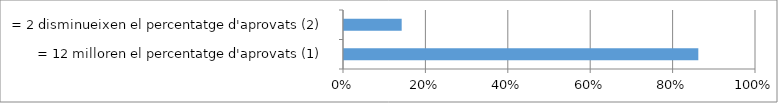
| Category | Series 0 |
|---|---|
| = 12 milloren el percentatge d'aprovats (1) | 0.86 |
| = 2 disminueixen el percentatge d'aprovats (2) | 0.14 |